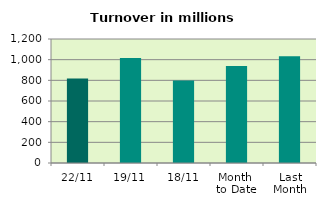
| Category | Series 0 |
|---|---|
| 22/11 | 817.552 |
| 19/11 | 1015.571 |
| 18/11 | 797.197 |
| Month 
to Date | 939.786 |
| Last
Month | 1032.218 |